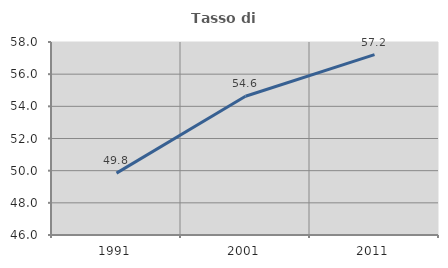
| Category | Tasso di occupazione   |
|---|---|
| 1991.0 | 49.847 |
| 2001.0 | 54.625 |
| 2011.0 | 57.216 |